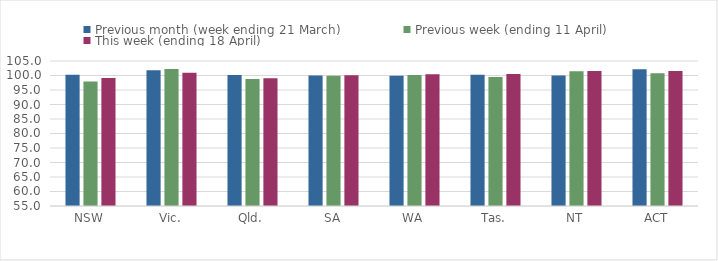
| Category | Previous month (week ending 21 March) | Previous week (ending 11 April) | This week (ending 18 April) |
|---|---|---|---|
| NSW | 100.293 | 97.892 | 99.105 |
| Vic. | 101.792 | 102.24 | 100.972 |
| Qld. | 100.157 | 98.808 | 99.041 |
| SA | 100 | 99.882 | 100.121 |
| WA | 99.945 | 100.131 | 100.401 |
| Tas. | 100.291 | 99.491 | 100.5 |
| NT | 100 | 101.508 | 101.542 |
| ACT | 102.119 | 100.742 | 101.565 |